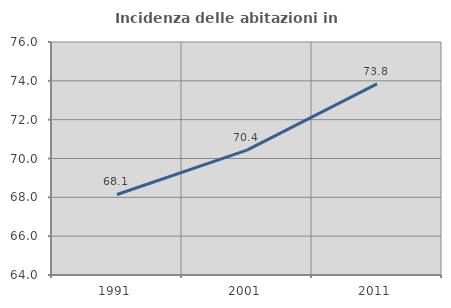
| Category | Incidenza delle abitazioni in proprietà  |
|---|---|
| 1991.0 | 68.147 |
| 2001.0 | 70.429 |
| 2011.0 | 73.84 |